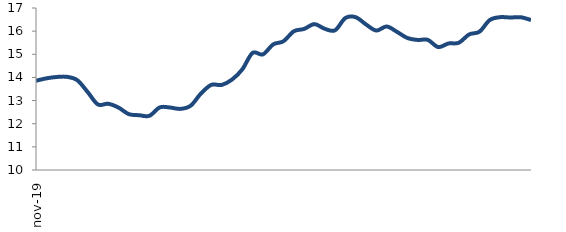
| Category | Series 0 |
|---|---|
| 2019-11-01 | 13.855 |
| 2019-12-01 | 13.96 |
| 2020-01-01 | 14.019 |
| 2020-02-01 | 14.026 |
| 2020-03-01 | 13.882 |
| 2020-04-01 | 13.374 |
| 2020-05-01 | 12.833 |
| 2020-06-01 | 12.862 |
| 2020-07-01 | 12.698 |
| 2020-08-01 | 12.414 |
| 2020-09-01 | 12.367 |
| 2020-10-01 | 12.342 |
| 2020-11-01 | 12.705 |
| 2020-12-01 | 12.699 |
| 2021-01-01 | 12.641 |
| 2021-02-01 | 12.779 |
| 2021-03-01 | 13.308 |
| 2021-04-01 | 13.679 |
| 2021-05-01 | 13.675 |
| 2021-06-01 | 13.905 |
| 2021-07-01 | 14.345 |
| 2021-08-01 | 15.059 |
| 2021-09-01 | 14.995 |
| 2021-10-01 | 15.427 |
| 2021-11-01 | 15.564 |
| 2021-12-01 | 15.993 |
| 2022-01-01 | 16.097 |
| 2022-02-01 | 16.304 |
| 2022-03-01 | 16.101 |
| 2022-04-01 | 16.037 |
| 2022-05-01 | 16.568 |
| 2022-06-01 | 16.602 |
| 2022-07-01 | 16.29 |
| 2022-08-01 | 16.026 |
| 2022-09-01 | 16.201 |
| 2022-10-01 | 15.97 |
| 2022-11-01 | 15.706 |
| 2022-12-01 | 15.62 |
| 2023-01-01 | 15.621 |
| 2023-02-01 | 15.312 |
| 2023-03-01 | 15.467 |
| 2023-04-01 | 15.498 |
| 2023-05-01 | 15.858 |
| 2023-06-01 | 15.975 |
| 2023-07-01 | 16.48 |
| 2023-08-01 | 16.604 |
| 2023-09-01 | 16.589 |
| 2023-10-01 | 16.601 |
| 2023-11-01 | 16.48 |